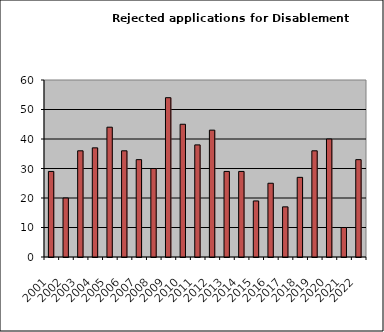
| Category | Series 0 |
|---|---|
| 2001.0 | 29 |
| 2002.0 | 20 |
| 2003.0 | 36 |
| 2004.0 | 37 |
| 2005.0 | 44 |
| 2006.0 | 36 |
| 2007.0 | 33 |
| 2008.0 | 30 |
| 2009.0 | 54 |
| 2010.0 | 45 |
| 2011.0 | 38 |
| 2012.0 | 43 |
| 2013.0 | 29 |
| 2014.0 | 29 |
| 2015.0 | 19 |
| 2016.0 | 25 |
| 2017.0 | 17 |
| 2018.0 | 27 |
| 2019.0 | 36 |
| 2020.0 | 40 |
| 2021.0 | 10 |
| 2022.0 | 33 |